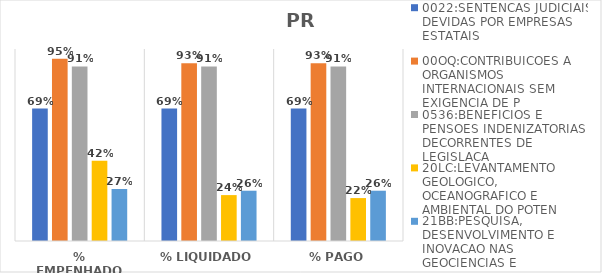
| Category | 0022:SENTENCAS JUDICIAIS DEVIDAS POR EMPRESAS ESTATAIS | 00OQ:CONTRIBUICOES A ORGANISMOS INTERNACIONAIS SEM EXIGENCIA DE P | 0536:BENEFICIOS E PENSOES INDENIZATORIAS DECORRENTES DE LEGISLACA | 20LC:LEVANTAMENTO GEOLOGICO, OCEANOGRAFICO E AMBIENTAL DO POTEN | 21BB:PESQUISA, DESENVOLVIMENTO E INOVACAO NAS GEOCIENCIAS E |
|---|---|---|---|---|---|
| % EMPENHADO | 0.689 | 0.95 | 0.909 | 0.418 | 0.271 |
| % LIQUIDADO | 0.689 | 0.926 | 0.909 | 0.239 | 0.262 |
| % PAGO | 0.689 | 0.926 | 0.909 | 0.224 | 0.262 |